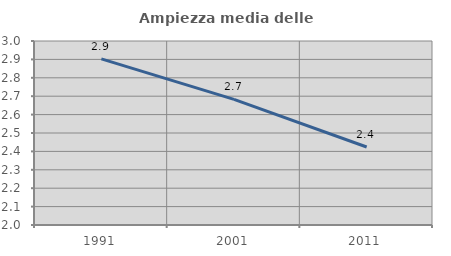
| Category | Ampiezza media delle famiglie |
|---|---|
| 1991.0 | 2.903 |
| 2001.0 | 2.683 |
| 2011.0 | 2.424 |